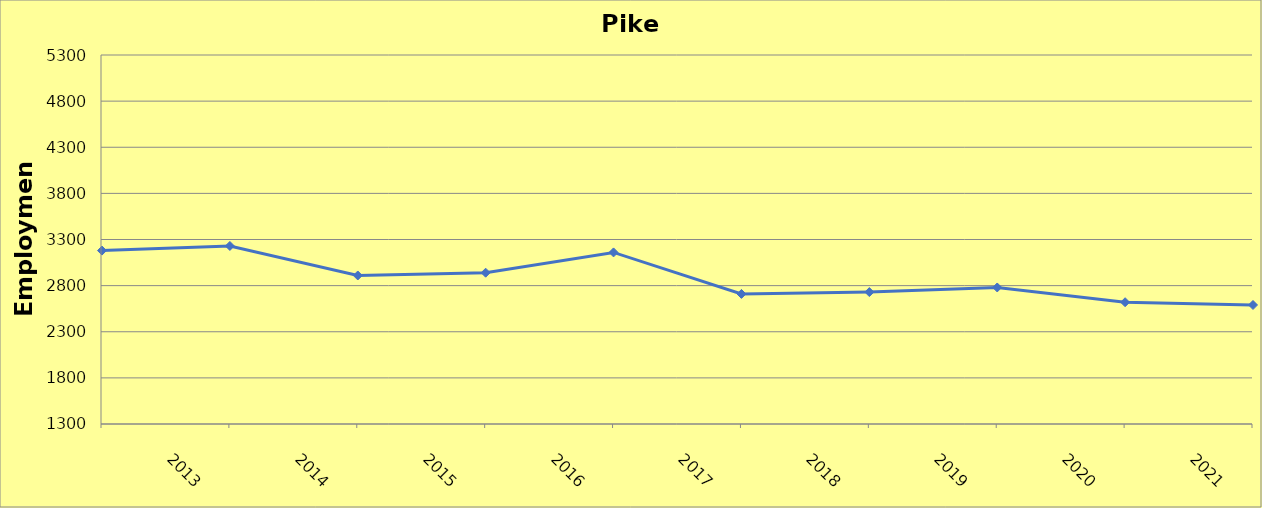
| Category | Pike County |
|---|---|
| 2013.0 | 3180 |
| 2014.0 | 3230 |
| 2015.0 | 2910 |
| 2016.0 | 2940 |
| 2017.0 | 3160 |
| 2018.0 | 2710 |
| 2019.0 | 2730 |
| 2020.0 | 2780 |
| 2021.0 | 2620 |
| 2022.0 | 2590 |